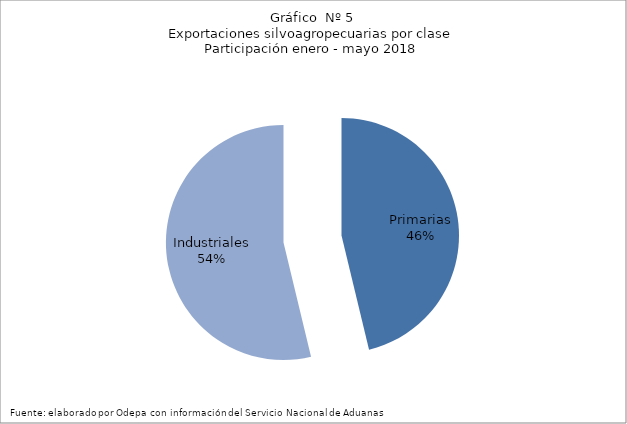
| Category | Series 0 |
|---|---|
| Primarias | 3690866 |
| Industriales | 4292566 |